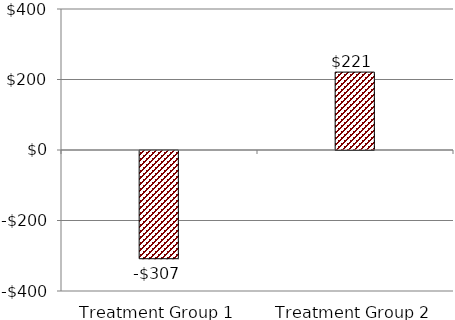
| Category | Series 0 |
|---|---|
| Treatment Group 1 | -307 |
| Treatment Group 2 | 221 |